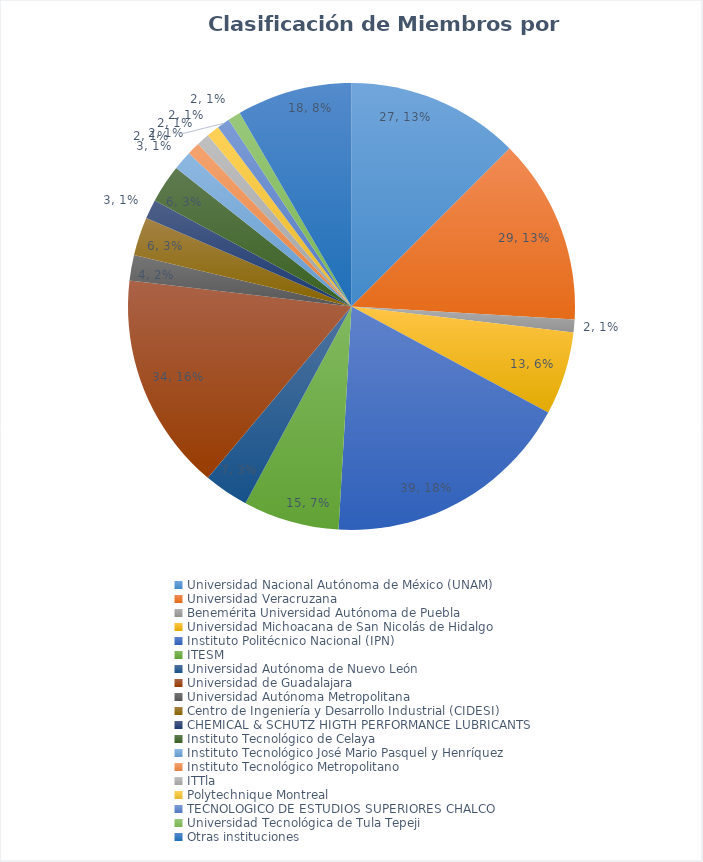
| Category | Series 0 |
|---|---|
| Universidad Nacional Autónoma de México (UNAM) | 27 |
| Universidad Veracruzana | 29 |
| Benemérita Universidad Autónoma de Puebla | 2 |
| Universidad Michoacana de San Nicolás de Hidalgo  | 13 |
| Instituto Politécnico Nacional (IPN) | 39 |
| ITESM | 15 |
| Universidad Autónoma de Nuevo León | 7 |
| Universidad de Guadalajara | 34 |
| Universidad Autónoma Metropolitana | 4 |
| Centro de Ingeniería y Desarrollo Industrial (CIDESI) | 6 |
| CHEMICAL & SCHUTZ HIGTH PERFORMANCE LUBRICANTS | 3 |
| Instituto Tecnológico de Celaya | 6 |
| Instituto Tecnológico José Mario Pasquel y Henríquez | 3 |
| Instituto Tecnológico Metropolitano | 2 |
| ITTla | 2 |
| Polytechnique Montreal | 2 |
| TECNOLOGICO DE ESTUDIOS SUPERIORES CHALCO | 2 |
| Universidad Tecnológica de Tula Tepeji | 2 |
| Otras instituciones | 18 |